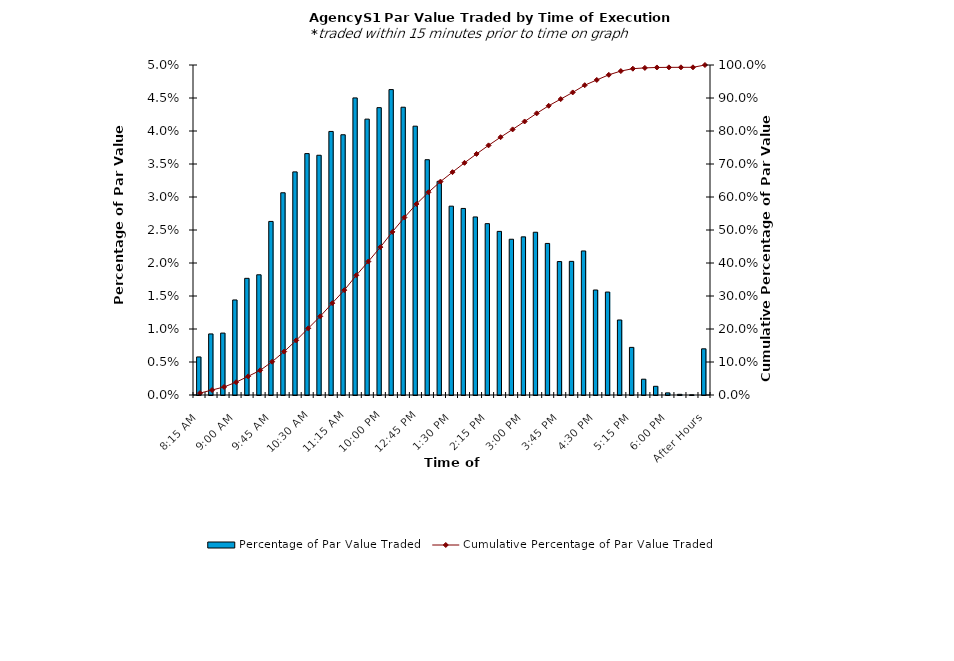
| Category | Percentage of Par Value Traded |
|---|---|
| 8:15 AM | 0.006 |
| 8:30 AM | 0.009 |
| 8:45 AM | 0.009 |
| 9:00 AM | 0.014 |
| 9:15 AM | 0.018 |
| 9:30 AM | 0.018 |
| 9:45 AM | 0.026 |
| 10:00 AM | 0.031 |
| 10:15 AM | 0.034 |
| 10:30 AM | 0.037 |
| 10:45 AM | 0.036 |
| 11:00 AM | 0.04 |
| 11:15 AM | 0.039 |
| 11:30 AM | 0.045 |
| 11:45 AM | 0.042 |
| 12:00 PM | 0.044 |
| 12:15 PM | 0.046 |
| 12:30 PM | 0.044 |
| 12:45 PM | 0.041 |
| 1:00 PM | 0.036 |
| 1:15 PM | 0.032 |
| 1:30 PM | 0.029 |
| 1:45 PM | 0.028 |
| 2:00 PM | 0.027 |
| 2:15 PM | 0.026 |
| 2:30 PM | 0.025 |
| 2:45 PM | 0.024 |
| 3:00 PM | 0.024 |
| 3:15 PM | 0.025 |
| 3:30 PM | 0.023 |
| 3:45 PM | 0.02 |
| 4:00 PM | 0.02 |
| 4:15 PM | 0.022 |
| 4:30 PM | 0.016 |
| 4:45 PM | 0.016 |
| 5:00 PM | 0.011 |
| 5:15 PM | 0.007 |
| 5:30 PM | 0.002 |
| 5:45 PM | 0.001 |
| 6:00 PM | 0 |
| 6:15 PM | 0 |
| 6:30 PM | 0 |
| After Hours | 0.007 |